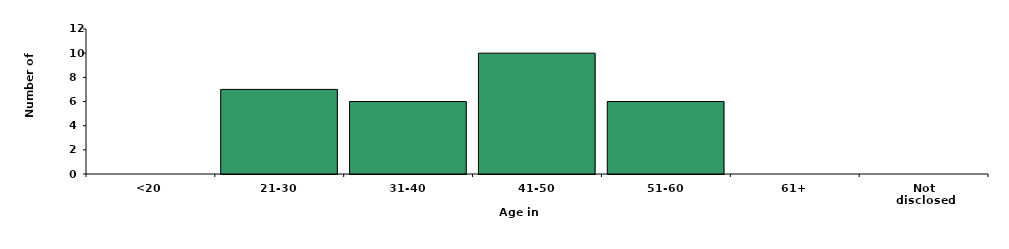
| Category | Series 0 |
|---|---|
| <20 | 0 |
| 21-30 | 7 |
| 31-40 | 6 |
| 41-50 | 10 |
| 51-60 | 6 |
| 61+ | 0 |
| Not disclosed | 0 |